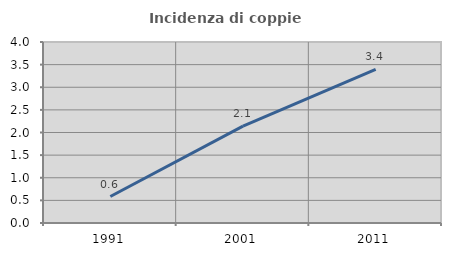
| Category | Incidenza di coppie miste |
|---|---|
| 1991.0 | 0.585 |
| 2001.0 | 2.14 |
| 2011.0 | 3.393 |